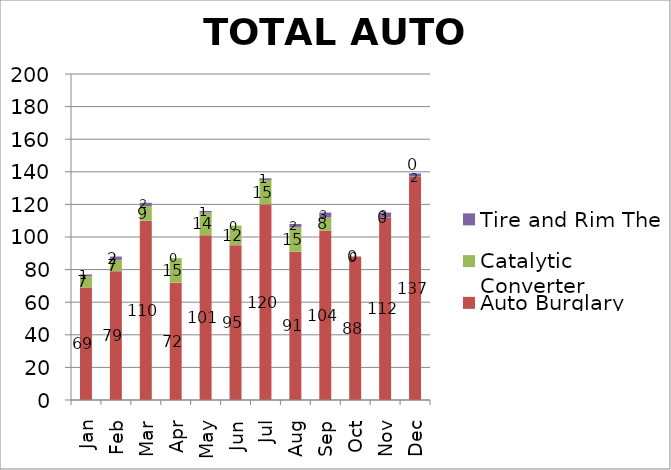
| Category | Auto Burglary | Catalytic Converter | Tire and Rim Theft |
|---|---|---|---|
| Jan | 69 | 7 | 1 |
| Feb | 79 | 7 | 2 |
| Mar | 110 | 9 | 2 |
| Apr | 72 | 15 | 0 |
| May | 101 | 14 | 1 |
| Jun | 95 | 12 | 0 |
| Jul | 120 | 15 | 1 |
| Aug | 91 | 15 | 2 |
| Sep | 104 | 8 | 3 |
| Oct | 88 | 0 | 0 |
| Nov | 112 | 0 | 3 |
| Dec | 137 | 0 | 2 |